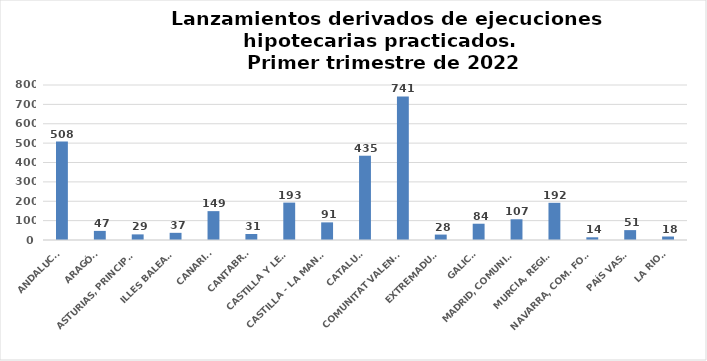
| Category | Series 0 |
|---|---|
| ANDALUCÍA | 508 |
| ARAGÓN | 47 |
| ASTURIAS, PRINCIPADO | 29 |
| ILLES BALEARS | 37 |
| CANARIAS | 149 |
| CANTABRIA | 31 |
| CASTILLA Y LEÓN | 193 |
| CASTILLA - LA MANCHA | 91 |
| CATALUÑA | 435 |
| COMUNITAT VALENCIANA | 741 |
| EXTREMADURA | 28 |
| GALICIA | 84 |
| MADRID, COMUNIDAD | 107 |
| MURCIA, REGIÓN | 192 |
| NAVARRA, COM. FORAL | 14 |
| PAÍS VASCO | 51 |
| LA RIOJA | 18 |